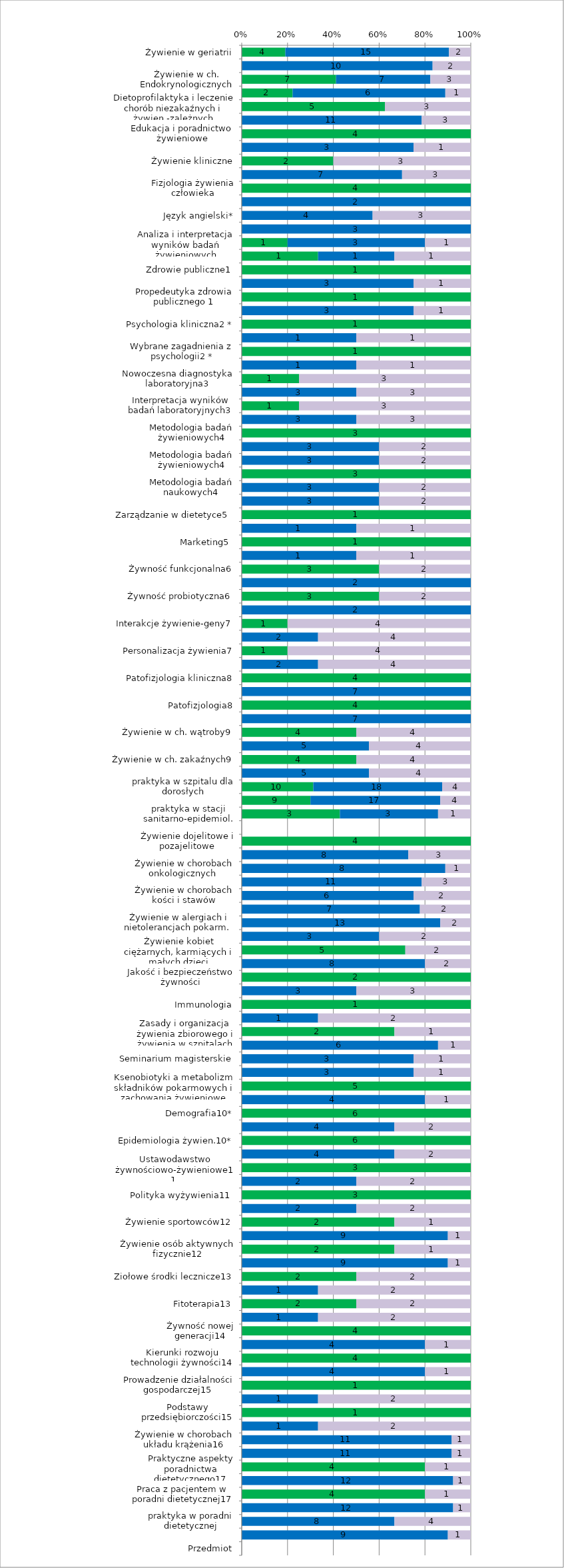
| Category | Series 0 | Series 1 | Series 2 |
|---|---|---|---|
| Żywienie w geriatrii | 4 | 15 | 2 |
| Żywienie w chorobach układu nerwowego | 0 | 10 | 2 |
| Żywienie w ch. Endokrynologicznych | 7 | 7 | 3 |
| Żywienie w stanach okołooperacyjnych | 2 | 6 | 1 |
| Dietoprofilaktyka i leczenie chorób niezakaźnych i żywien.-zależnych | 5 | 0 | 3 |
| Dietoprofilaktyka i leczenie chorób niezakaźnych i żywien.-zależnych | 0 | 11 | 3 |
| Edukacja i poradnictwo żywieniowe | 4 | 0 | 0 |
| Edukacja i poradnictwo żywieniowe | 0 | 3 | 1 |
| Żywienie kliniczne | 2 | 0 | 3 |
| Żywienie kliniczne | 0 | 7 | 3 |
| Fizjologia żywienia człowieka | 4 | 0 | 0 |
| Fizjologia żywienia człowieka | 0 | 2 | 0 |
| Język angielski* | 0 | 4 | 3 |
| Seminarium magisterskie | 0 | 3 | 0 |
| Analiza i interpretacja wyników badań żywieniowych | 1 | 3 | 1 |
| Wychowanie fizyczne | 1 | 1 | 1 |
| Zdrowie publiczne1 | 1 | 0 | 0 |
| Zdrowie publiczne1 | 0 | 3 | 1 |
| Propedeutyka zdrowia publicznego 1 | 1 | 0 | 0 |
| Propedeutyka zdrowia publicznego 1 | 0 | 3 | 1 |
| Psychologia kliniczna2 * | 1 | 0 | 0 |
| Psychologia kliniczna2 * | 0 | 1 | 1 |
| Wybrane zagadnienia z psychologii2 * | 1 | 0 | 0 |
| Wybrane zagadnienia z psychologii2 * | 0 | 1 | 1 |
| Nowoczesna diagnostyka laboratoryjna3 | 1 | 0 | 3 |
| Nowoczesna diagnostyka laboratoryjna3 | 0 | 3 | 3 |
| Interpretacja wyników badań laboratoryjnych3 | 1 | 0 | 3 |
| Interpretacja wyników badań laboratoryjnych3 | 0 | 3 | 3 |
| Metodologia badań żywieniowych4 | 3 | 0 | 0 |
| Metodologia badań żywieniowych4 | 0 | 3 | 2 |
| Metodologia badań żywieniowych4 | 0 | 3 | 2 |
| Metodologia badań naukowych4 | 3 | 0 | 0 |
| Metodologia badań naukowych4 | 0 | 3 | 2 |
| Metodologia badań naukowych4 | 0 | 3 | 2 |
| Zarządzanie w dietetyce5  | 1 | 0 | 0 |
| Zarządzanie w dietetyce5  | 0 | 1 | 1 |
| Marketing5  | 1 | 0 | 0 |
| Marketing5  | 0 | 1 | 1 |
| Żywność funkcjonalna6 | 3 | 0 | 2 |
| Żywność funkcjonalna6 | 0 | 2 | 0 |
| Żywność probiotyczna6 | 3 | 0 | 2 |
| Żywność probiotyczna6 | 0 | 2 | 0 |
| Interakcje żywienie-geny7 | 1 | 0 | 4 |
| Interakcje żywienie-geny7 | 0 | 2 | 4 |
| Personalizacja żywienia7 | 1 | 0 | 4 |
| Personalizacja żywienia7 | 0 | 2 | 4 |
| Patofizjologia kliniczna8 | 4 | 0 | 0 |
| Patofizjologia kliniczna8 | 0 | 7 | 0 |
| Patofizjologia8 | 4 | 0 | 0 |
| Patofizjologia8 | 0 | 7 | 0 |
| Żywienie w ch. wątroby9 | 4 | 0 | 4 |
| Żywienie w ch. wątroby9 | 0 | 5 | 4 |
| Żywienie w ch. zakaźnych9 | 4 | 0 | 4 |
| Żywienie w ch. zakaźnych9 | 0 | 5 | 4 |
| praktyka w szpitalu dla dorosłych | 10 | 18 | 4 |
| praktyka w szpitalu dla dzieci | 9 | 17 | 4 |
| praktyka w stacji sanitarno-epidemiol. | 3 | 3 | 1 |
| Przedmiot | 0 | 0 | 0 |
| Żywienie dojelitowe i pozajelitowe | 4 | 0 | 0 |
| Żywienie dojelitowe i pozajelitowe | 0 | 8 | 3 |
| Żywienie w chorobach onkologicznych  | 0 | 8 | 1 |
| Żywienie w chobach przewodu pokarmowego  | 0 | 11 | 3 |
| Żywienie w chorobach kości i stawów | 0 | 6 | 2 |
| Żywienie w chorobach nerek | 0 | 7 | 2 |
| Żywienie w alergiach i nietolerancjach pokarm.  | 0 | 13 | 2 |
| Produkcja potraw | 0 | 3 | 2 |
| Żywienie kobiet ciężarnych, karmiących i małych dzieci | 5 | 0 | 2 |
| Żywienie kobiet ciężarnych, karmiących i małych dzieci | 0 | 8 | 2 |
| Jakość i bezpieczeństwo żywności | 2 | 0 | 0 |
| Jakość i bezpieczeństwo żywności | 0 | 3 | 3 |
| Immunologia | 1 | 0 | 0 |
| Immunologia | 0 | 1 | 2 |
| Zasady i organizacja żywienia zbiorowego i żywienia w szpitalach | 2 | 0 | 1 |
| Zasady i organizacja żywienia zbiorowego i żywienia w szpitalach | 0 | 6 | 1 |
| Seminarium magisterskie | 0 | 3 | 1 |
| Seminarium magisterskie | 0 | 3 | 1 |
| Ksenobiotyki a metabolizm składników pokarmowych i zachowania żywieniowe | 5 | 0 | 0 |
| Ksenobiotyki a metabolizm składników pokarmowych i zachowania żywieniowe | 0 | 4 | 1 |
| Demografia10* | 6 | 0 | 0 |
| Demografia10* | 0 | 4 | 2 |
| Epidemiologia żywien.10* | 6 | 0 | 0 |
| Epidemiologia żywien.10* | 0 | 4 | 2 |
| Ustawodawstwo żywnościowo-żywieniowe11  | 3 | 0 | 0 |
| Ustawodawstwo żywnościowo-żywieniowe11  | 0 | 2 | 2 |
| Polityka wyżywienia11  | 3 | 0 | 0 |
| Polityka wyżywienia11  | 0 | 2 | 2 |
| Żywienie sportowców12 | 2 | 0 | 1 |
| Żywienie sportowców12 | 0 | 9 | 1 |
| Żywienie osób aktywnych fizycznie12 | 2 | 0 | 1 |
| Żywienie osób aktywnych fizycznie12 | 0 | 9 | 1 |
| Ziołowe środki lecznicze13 | 2 | 0 | 2 |
| Ziołowe środki lecznicze13 | 0 | 1 | 2 |
| Fitoterapia13 | 2 | 0 | 2 |
| Fitoterapia13 | 0 | 1 | 2 |
| Żywność nowej generacji14 | 4 | 0 | 0 |
| Żywność nowej generacji14 | 0 | 4 | 1 |
| Kierunki rozwoju technologii żywności14 | 4 | 0 | 0 |
| Kierunki rozwoju technologii żywności14 | 0 | 4 | 1 |
| Prowadzenie działalności gospodarczej15 | 1 | 0 | 0 |
| Prowadzenie działalności gospodarczej15 | 0 | 1 | 2 |
| Podstawy przedsiębiorczości15 | 1 | 0 | 0 |
| Podstawy przedsiębiorczości15 | 0 | 1 | 2 |
| Żywienie w chorobach układu krążenia16 | 0 | 11 | 1 |
| Żywienie w ostrych i przewlekłych powikłaniach miażdżycy16 | 0 | 11 | 1 |
| Praktyczne aspekty poradnictwa dietetycznego17 | 4 | 0 | 1 |
| Praktyczne aspekty poradnictwa dietetycznego17 | 0 | 12 | 1 |
| Praca z pacjentem w poradni dietetycznej17 | 4 | 0 | 1 |
| Praca z pacjentem w poradni dietetycznej17 | 0 | 12 | 1 |
| praktyka w poradni dietetycznej | 0 | 8 | 4 |
| praktyka w domu opieki społecznej | 0 | 9 | 1 |
| Przedmiot | 0 | 0 | 0 |